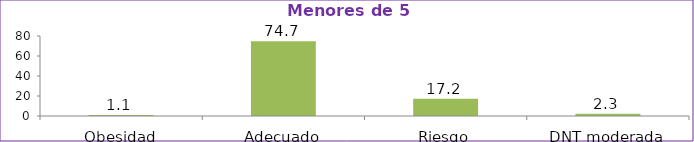
| Category | Series 0 |
|---|---|
| Obesidad | 1.1 |
| Adecuado | 74.7 |
| Riesgo | 17.2 |
| DNT moderada | 2.3 |